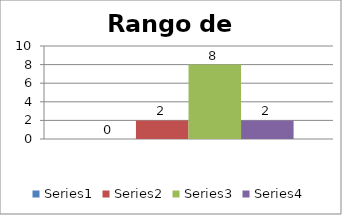
| Category | Series 0 | Series 1 | Series 2 | Series 3 |
|---|---|---|---|---|
| 0 | 0 | 2 | 8 | 2 |